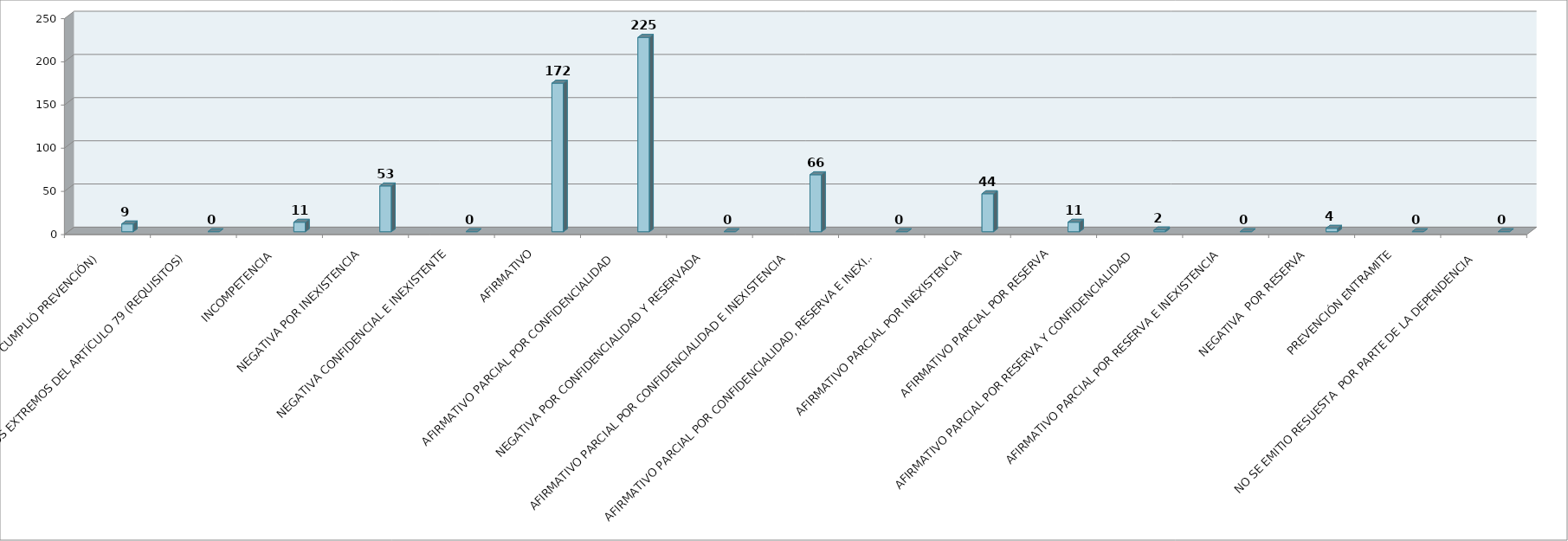
| Category | Series 0 | Series 1 | Series 2 | Series 3 | Series 4 | Series 5 |
|---|---|---|---|---|---|---|
| SE TIENE POR NO PRESENTADA ( NO CUMPLIÓ PREVENCIÓN) |  |  |  |  | 9 |  |
| NO CUMPLIO CON LOS EXTREMOS DEL ARTÍCULO 79 (REQUISITOS) |  |  |  |  | 0 |  |
| INCOMPETENCIA  |  |  |  |  | 11 |  |
| NEGATIVA POR INEXISTENCIA |  |  |  |  | 53 |  |
| NEGATIVA CONFIDENCIAL E INEXISTENTE |  |  |  |  | 0 |  |
| AFIRMATIVO |  |  |  |  | 172 |  |
| AFIRMATIVO PARCIAL POR CONFIDENCIALIDAD  |  |  |  |  | 225 |  |
| NEGATIVA POR CONFIDENCIALIDAD Y RESERVADA |  |  |  |  | 0 |  |
| AFIRMATIVO PARCIAL POR CONFIDENCIALIDAD E INEXISTENCIA |  |  |  |  | 66 |  |
| AFIRMATIVO PARCIAL POR CONFIDENCIALIDAD, RESERVA E INEXISTENCIA |  |  |  |  | 0 |  |
| AFIRMATIVO PARCIAL POR INEXISTENCIA |  |  |  |  | 44 |  |
| AFIRMATIVO PARCIAL POR RESERVA |  |  |  |  | 11 |  |
| AFIRMATIVO PARCIAL POR RESERVA Y CONFIDENCIALIDAD |  |  |  |  | 2 |  |
| AFIRMATIVO PARCIAL POR RESERVA E INEXISTENCIA |  |  |  |  | 0 |  |
| NEGATIVA  POR RESERVA |  |  |  |  | 4 |  |
| PREVENCIÓN ENTRAMITE |  |  |  |  | 0 |  |
| NO SE EMITIO RESUESTA  POR PARTE DE LA DEPENDENCIA |  |  |  |  | 0 |  |